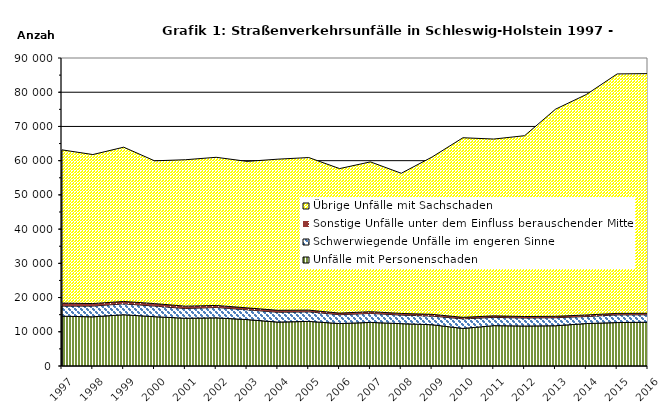
| Category | Unfälle mit Personenschaden | Schwerwiegende Unfälle im engeren Sinne | Sonstige Unfälle unter dem Einfluss berauschender Mittel 1) | Übrige Unfälle mit Sachschaden |
|---|---|---|---|---|
| 1997.0 | 14549 | 2947 | 883 | 44777 |
| 1998.0 | 14376 | 3136 | 737 | 43539 |
| 1999.0 | 14979 | 3185 | 696 | 45079 |
| 2000.0 | 14406 | 3105 | 725 | 41724 |
| 2001.0 | 13950 | 2845 | 688 | 42788 |
| 2002.0 | 14072 | 3028 | 595 | 43289 |
| 2003.0 | 13561 | 2866 | 559 | 42806 |
| 2004.0 | 12827 | 2877 | 564 | 44173 |
| 2005.0 | 13033 | 2795 | 499 | 44581 |
| 2006.0 | 12400 | 2588 | 466 | 42228 |
| 2007.0 | 12740 | 2628 | 507 | 43770 |
| 2008.0 | 12369 | 2510 | 481 | 40954 |
| 2009.0 | 12061 | 2528 | 502 | 45976 |
| 2010.0 | 10974 | 2803 | 441 | 52481 |
| 2011.0 | 11793 | 2419 | 443 | 51662 |
| 2012.0 | 11682 | 2353 | 422 | 52839 |
| 2013.0 | 11757 | 2357 | 414 | 60506 |
| 2014.0 | 12404 | 2056 | 448 | 64425 |
| 2015.0 | 12695 | 2249 | 427 | 69975 |
| 2016.0 | 12783 | 2187 | 433 | 70040 |